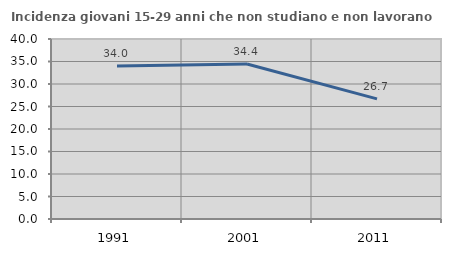
| Category | Incidenza giovani 15-29 anni che non studiano e non lavorano  |
|---|---|
| 1991.0 | 34.004 |
| 2001.0 | 34.439 |
| 2011.0 | 26.689 |